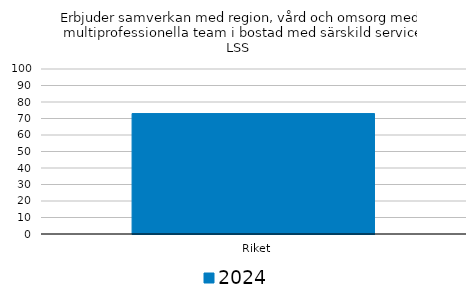
| Category | 2024 |
|---|---|
|   Riket | 73 |